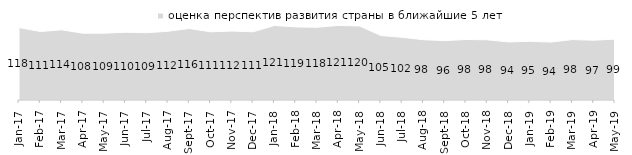
| Category | оценка перспектив развития страны в ближайшие 5 лет |
|---|---|
| 2017-01-01 | 117.55 |
| 2017-02-01 | 111.15 |
| 2017-03-01 | 113.85 |
| 2017-04-01 | 108.45 |
| 2017-05-01 | 108.5 |
| 2017-06-01 | 109.95 |
| 2017-07-01 | 109.2 |
| 2017-08-01 | 111.65 |
| 2017-09-01 | 115.95 |
| 2017-10-01 | 110.7 |
| 2017-11-01 | 111.95 |
| 2017-12-01 | 110.7 |
| 2018-01-01 | 120.9 |
| 2018-02-01 | 118.65 |
| 2018-03-01 | 118.1 |
| 2018-04-01 | 121 |
| 2018-05-01 | 120.15 |
| 2018-06-01 | 104.6 |
| 2018-07-01 | 101.85 |
| 2018-08-01 | 97.85 |
| 2018-09-01 | 96.4 |
| 2018-10-01 | 98.25 |
| 2018-11-01 | 97.705 |
| 2018-12-01 | 94.3 |
| 2019-01-01 | 95.25 |
| 2019-02-01 | 94.05 |
| 2019-03-01 | 98.11 |
| 2019-04-01 | 97.03 |
| 2019-05-01 | 98.91 |